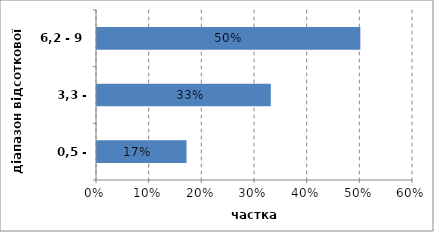
| Category | Series 0 |
|---|---|
| 0,5 - 3,3 | 0.17 |
| 3,3 - 6,2 | 0.33 |
| 6,2 - 9 | 0.5 |